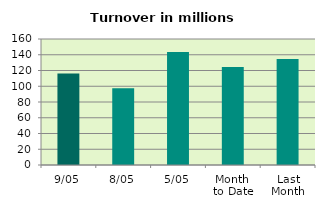
| Category | Series 0 |
|---|---|
| 9/05 | 116.149 |
| 8/05 | 97.598 |
| 5/05 | 143.537 |
| Month 
to Date | 124.408 |
| Last
Month | 134.694 |